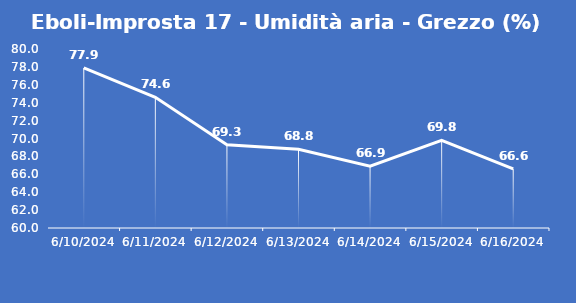
| Category | Eboli-Improsta 17 - Umidità aria - Grezzo (%) |
|---|---|
| 6/10/24 | 77.9 |
| 6/11/24 | 74.6 |
| 6/12/24 | 69.3 |
| 6/13/24 | 68.8 |
| 6/14/24 | 66.9 |
| 6/15/24 | 69.8 |
| 6/16/24 | 66.6 |